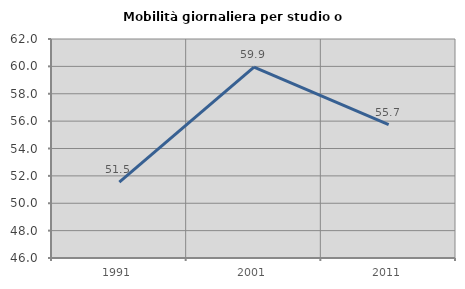
| Category | Mobilità giornaliera per studio o lavoro |
|---|---|
| 1991.0 | 51.542 |
| 2001.0 | 59.938 |
| 2011.0 | 55.738 |